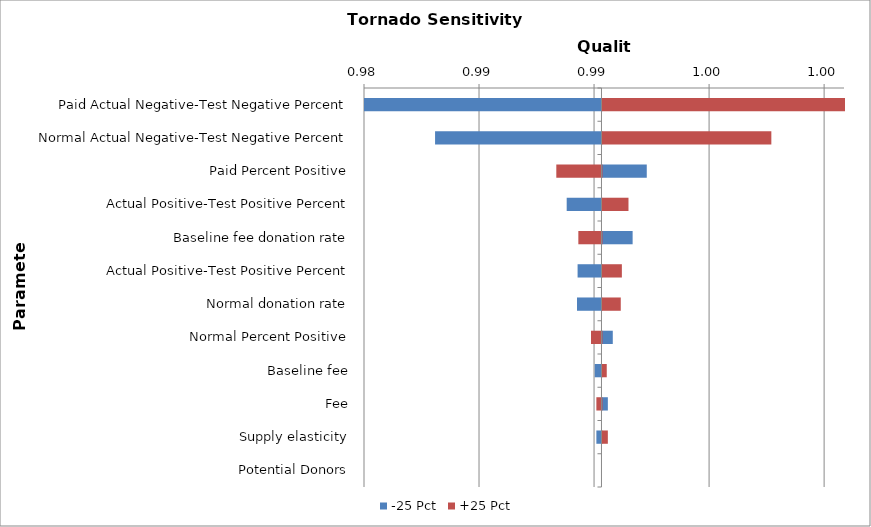
| Category | -25 Pct | +25 Pct |
|---|---|---|
| Paid Actual Negative-Test Negative Percent | 0.981 | 1.002 |
| Normal Actual Negative-Test Negative Percent | 0.984 | 0.998 |
| Paid Percent Positive | 0.993 | 0.989 |
| Actual Positive-Test Positive Percent | 0.99 | 0.992 |
| Baseline fee donation rate | 0.992 | 0.99 |
| Actual Positive-Test Positive Percent | 0.99 | 0.992 |
| Normal donation rate | 0.99 | 0.992 |
| Normal Percent Positive | 0.991 | 0.991 |
| Baseline fee | 0.991 | 0.991 |
| Fee | 0.991 | 0.991 |
| Supply elasticity | 0.991 | 0.991 |
| Potential Donors | 0.991 | 0.991 |